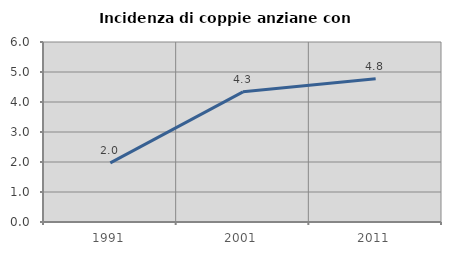
| Category | Incidenza di coppie anziane con figli |
|---|---|
| 1991.0 | 1.97 |
| 2001.0 | 4.34 |
| 2011.0 | 4.771 |